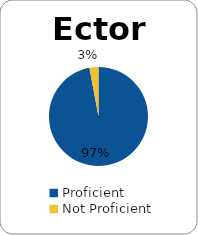
| Category | Series 0 |
|---|---|
| Proficient | 0.971 |
| Not Proficient | 0.029 |